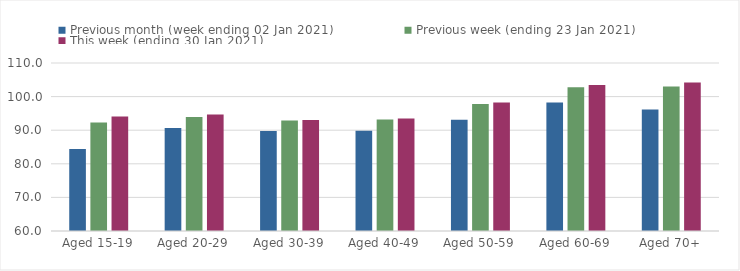
| Category | Previous month (week ending 02 Jan 2021) | Previous week (ending 23 Jan 2021) | This week (ending 30 Jan 2021) |
|---|---|---|---|
| Aged 15-19 | 84.37 | 92.26 | 94.05 |
| Aged 20-29 | 90.63 | 93.91 | 94.67 |
| Aged 30-39 | 89.75 | 92.91 | 93.02 |
| Aged 40-49 | 89.83 | 93.15 | 93.5 |
| Aged 50-59 | 93.14 | 97.82 | 98.24 |
| Aged 60-69 | 98.22 | 102.77 | 103.48 |
| Aged 70+ | 96.19 | 102.99 | 104.17 |